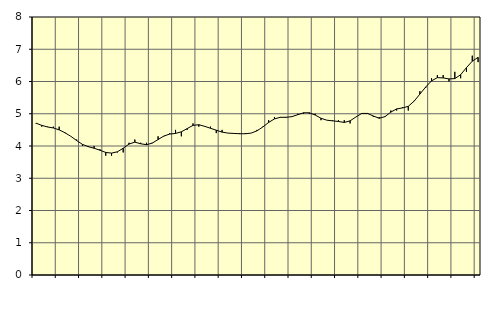
| Category | Piggar | Information och kommunikation, SNI 58-63 |
|---|---|---|
| nan | 4.7 | 4.71 |
| 1.0 | 4.6 | 4.64 |
| 1.0 | 4.6 | 4.59 |
| 1.0 | 4.6 | 4.56 |
| nan | 4.6 | 4.5 |
| 2.0 | 4.4 | 4.41 |
| 2.0 | 4.3 | 4.3 |
| 2.0 | 4.2 | 4.17 |
| nan | 4 | 4.05 |
| 3.0 | 4 | 3.98 |
| 3.0 | 4 | 3.93 |
| 3.0 | 3.9 | 3.87 |
| nan | 3.7 | 3.8 |
| 4.0 | 3.7 | 3.78 |
| 4.0 | 3.8 | 3.82 |
| 4.0 | 3.8 | 3.93 |
| nan | 4.1 | 4.06 |
| 5.0 | 4.2 | 4.12 |
| 5.0 | 4.1 | 4.07 |
| 5.0 | 4.1 | 4.04 |
| nan | 4.1 | 4.09 |
| 6.0 | 4.3 | 4.2 |
| 6.0 | 4.3 | 4.31 |
| 6.0 | 4.4 | 4.37 |
| nan | 4.5 | 4.39 |
| 7.0 | 4.3 | 4.44 |
| 7.0 | 4.5 | 4.54 |
| 7.0 | 4.7 | 4.64 |
| nan | 4.6 | 4.66 |
| 8.0 | 4.6 | 4.61 |
| 8.0 | 4.6 | 4.55 |
| 8.0 | 4.4 | 4.49 |
| nan | 4.5 | 4.43 |
| 9.0 | 4.4 | 4.4 |
| 9.0 | 4.4 | 4.39 |
| 9.0 | 4.4 | 4.38 |
| nan | 4.4 | 4.38 |
| 10.0 | 4.4 | 4.4 |
| 10.0 | 4.5 | 4.47 |
| 10.0 | 4.6 | 4.59 |
| nan | 4.8 | 4.73 |
| 11.0 | 4.9 | 4.84 |
| 11.0 | 4.9 | 4.89 |
| 11.0 | 4.9 | 4.89 |
| nan | 4.9 | 4.91 |
| 12.0 | 5 | 4.97 |
| 12.0 | 5 | 5.03 |
| 12.0 | 5 | 5.03 |
| nan | 5 | 4.96 |
| 13.0 | 4.8 | 4.86 |
| 13.0 | 4.8 | 4.8 |
| 13.0 | 4.8 | 4.78 |
| nan | 4.8 | 4.76 |
| 14.0 | 4.8 | 4.73 |
| 14.0 | 4.7 | 4.78 |
| 14.0 | 4.9 | 4.9 |
| nan | 5 | 5.01 |
| 15.0 | 5 | 5.01 |
| 15.0 | 4.9 | 4.93 |
| 15.0 | 4.9 | 4.86 |
| nan | 4.9 | 4.91 |
| 16.0 | 5.1 | 5.05 |
| 16.0 | 5.1 | 5.15 |
| 16.0 | 5.2 | 5.18 |
| nan | 5.1 | 5.23 |
| 17.0 | 5.4 | 5.39 |
| 17.0 | 5.7 | 5.61 |
| 17.0 | 5.8 | 5.83 |
| nan | 6.1 | 6.02 |
| 18.0 | 6.2 | 6.12 |
| 18.0 | 6.2 | 6.11 |
| 18.0 | 6 | 6.08 |
| nan | 6.3 | 6.09 |
| 19.0 | 6.1 | 6.21 |
| 19.0 | 6.3 | 6.43 |
| 19.0 | 6.8 | 6.63 |
| nan | 6.6 | 6.75 |